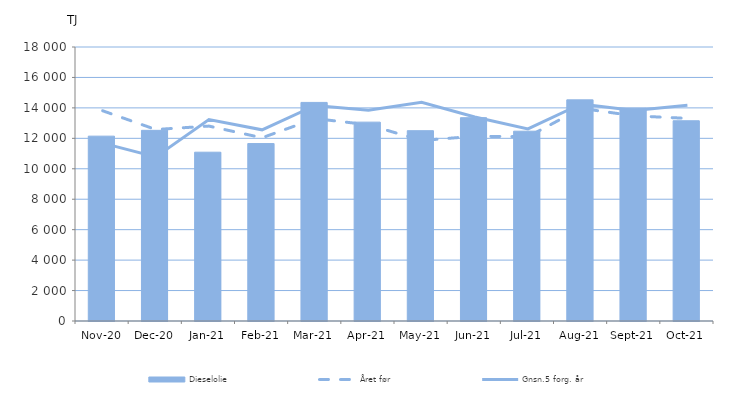
| Category | Dieselolie |
|---|---|
| 2020-11-01 | 12143.685 |
| 2020-12-01 | 12525.536 |
| 2021-01-01 | 11089.561 |
| 2021-02-01 | 11657.208 |
| 2021-03-01 | 14359.861 |
| 2021-04-01 | 13064.309 |
| 2021-05-01 | 12502.867 |
| 2021-06-01 | 13356.741 |
| 2021-07-01 | 12469.367 |
| 2021-08-01 | 14528.513 |
| 2021-09-01 | 13974.424 |
| 2021-10-01 | 13154.589 |